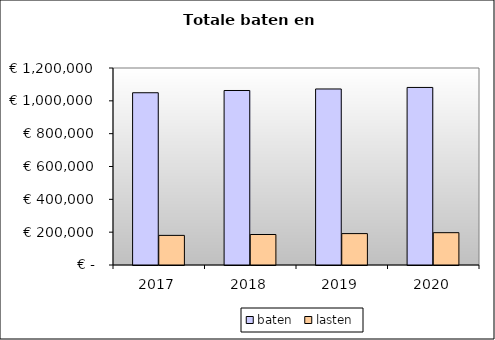
| Category | baten | lasten |
|---|---|---|
| 2017.0 | 1049308.947 | 180384.893 |
| 2018.0 | 1063024.42 | 185774.629 |
| 2019.0 | 1072265.553 | 191279.837 |
| 2020.0 | 1081506.686 | 196851.646 |